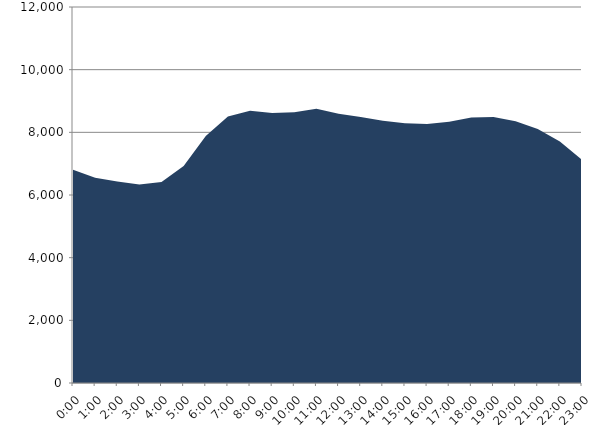
| Category | Series 0 | Series 1 |
|---|---|---|
| 2022-05-18 |  | 6803.65 |
| 2022-05-18 01:00:00 |  | 6546.926 |
| 2022-05-18 02:00:00 |  | 6428.166 |
| 2022-05-18 03:00:00 |  | 6331.79 |
| 2022-05-18 04:00:00 |  | 6415.163 |
| 2022-05-18 05:00:00 |  | 6926.979 |
| 2022-05-18 06:00:00 |  | 7879.122 |
| 2022-05-18 07:00:00 |  | 8509.016 |
| 2022-05-18 08:00:00 |  | 8689.285 |
| 2022-05-18 09:00:00 |  | 8616.19 |
| 2022-05-18 10:00:00 |  | 8639.12 |
| 2022-05-18 11:00:00 |  | 8754.305 |
| 2022-05-18 12:00:00 |  | 8589.333 |
| 2022-05-18 13:00:00 |  | 8492.083 |
| 2022-05-18 14:00:00 |  | 8371.947 |
| 2022-05-18 15:00:00 |  | 8293.528 |
| 2022-05-18 16:00:00 |  | 8267.098 |
| 2022-05-18 17:00:00 |  | 8341.597 |
| 2022-05-18 18:00:00 |  | 8475.261 |
| 2022-05-18 19:00:00 |  | 8486.356 |
| 2022-05-18 20:00:00 |  | 8353.344 |
| 2022-05-18 21:00:00 |  | 8106.033 |
| 2022-05-18 22:00:00 |  | 7707.858 |
| 2022-05-18 23:00:00 |  | 7126.455 |